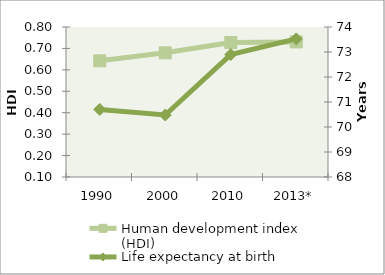
| Category | Human development index (HDI) |
|---|---|
| 1990 | 0.642 |
| 2000 | 0.679 |
| 2010 | 0.727 |
| 2013* | 0.73 |